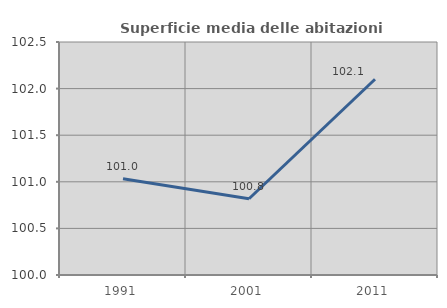
| Category | Superficie media delle abitazioni occupate |
|---|---|
| 1991.0 | 101.034 |
| 2001.0 | 100.818 |
| 2011.0 | 102.1 |